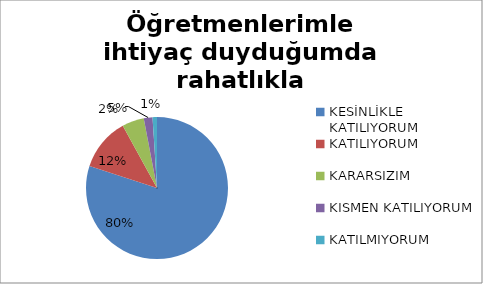
| Category | Öğretmenlerimle ihtiyaç duyduğumda rahatlıkla görüşebilirim. |
|---|---|
| KESİNLİKLE KATILIYORUM | 160 |
| KATILIYORUM | 24 |
| KARARSIZIM | 10 |
| KISMEN KATILIYORUM | 4 |
| KATILMIYORUM | 2 |